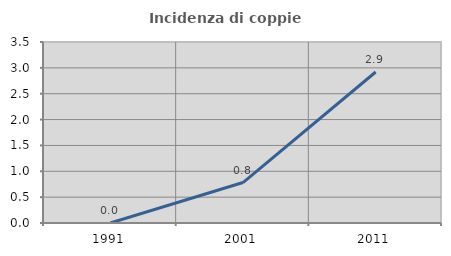
| Category | Incidenza di coppie miste |
|---|---|
| 1991.0 | 0 |
| 2001.0 | 0.782 |
| 2011.0 | 2.92 |